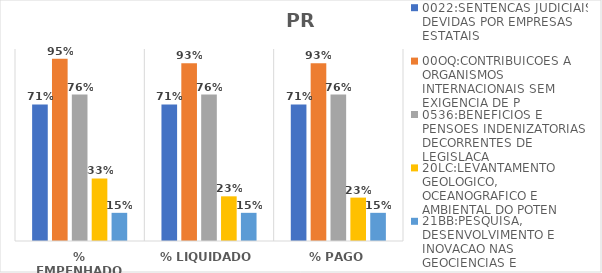
| Category | 0022:SENTENCAS JUDICIAIS DEVIDAS POR EMPRESAS ESTATAIS | 00OQ:CONTRIBUICOES A ORGANISMOS INTERNACIONAIS SEM EXIGENCIA DE P | 0536:BENEFICIOS E PENSOES INDENIZATORIAS DECORRENTES DE LEGISLACA | 20LC:LEVANTAMENTO GEOLOGICO, OCEANOGRAFICO E AMBIENTAL DO POTEN | 21BB:PESQUISA, DESENVOLVIMENTO E INOVACAO NAS GEOCIENCIAS E |
|---|---|---|---|---|---|
| % EMPENHADO | 0.711 | 0.95 | 0.763 | 0.326 | 0.147 |
| % LIQUIDADO | 0.711 | 0.926 | 0.763 | 0.233 | 0.147 |
| % PAGO | 0.711 | 0.926 | 0.763 | 0.226 | 0.147 |